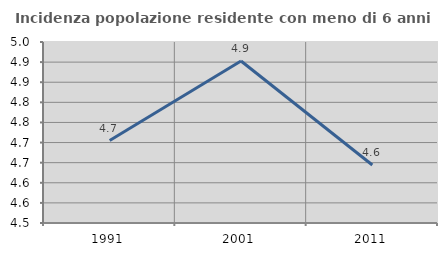
| Category | Incidenza popolazione residente con meno di 6 anni |
|---|---|
| 1991.0 | 4.705 |
| 2001.0 | 4.903 |
| 2011.0 | 4.644 |